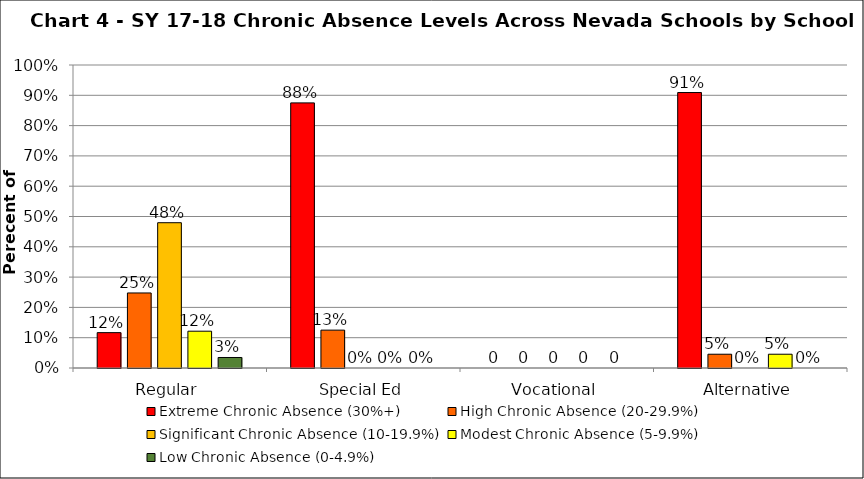
| Category | Extreme Chronic Absence (30%+) | High Chronic Absence (20-29.9%) | Significant Chronic Absence (10-19.9%) | Modest Chronic Absence (5-9.9%) | Low Chronic Absence (0-4.9%) |
|---|---|---|---|---|---|
| 0 | 0.117 | 0.248 | 0.479 | 0.121 | 0.035 |
| 1 | 0.875 | 0.125 | 0 | 0 | 0 |
| 2 | 0 | 0 | 0 | 0 | 0 |
| 3 | 0.909 | 0.045 | 0 | 0.045 | 0 |